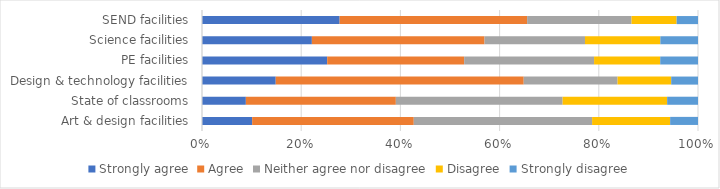
| Category | Strongly agree | Agree | Neither agree nor disagree | Disagree | Strongly disagree |
|---|---|---|---|---|---|
| Art & design facilities | 0.101 | 0.326 | 0.36 | 0.157 | 0.056 |
| State of classrooms | 0.088 | 0.302 | 0.336 | 0.211 | 0.062 |
| Design & technology facilities | 0.149 | 0.5 | 0.189 | 0.108 | 0.054 |
| PE facilities | 0.252 | 0.276 | 0.262 | 0.133 | 0.076 |
| Science facilities | 0.222 | 0.348 | 0.203 | 0.152 | 0.076 |
| SEND facilities | 0.278 | 0.378 | 0.211 | 0.091 | 0.043 |